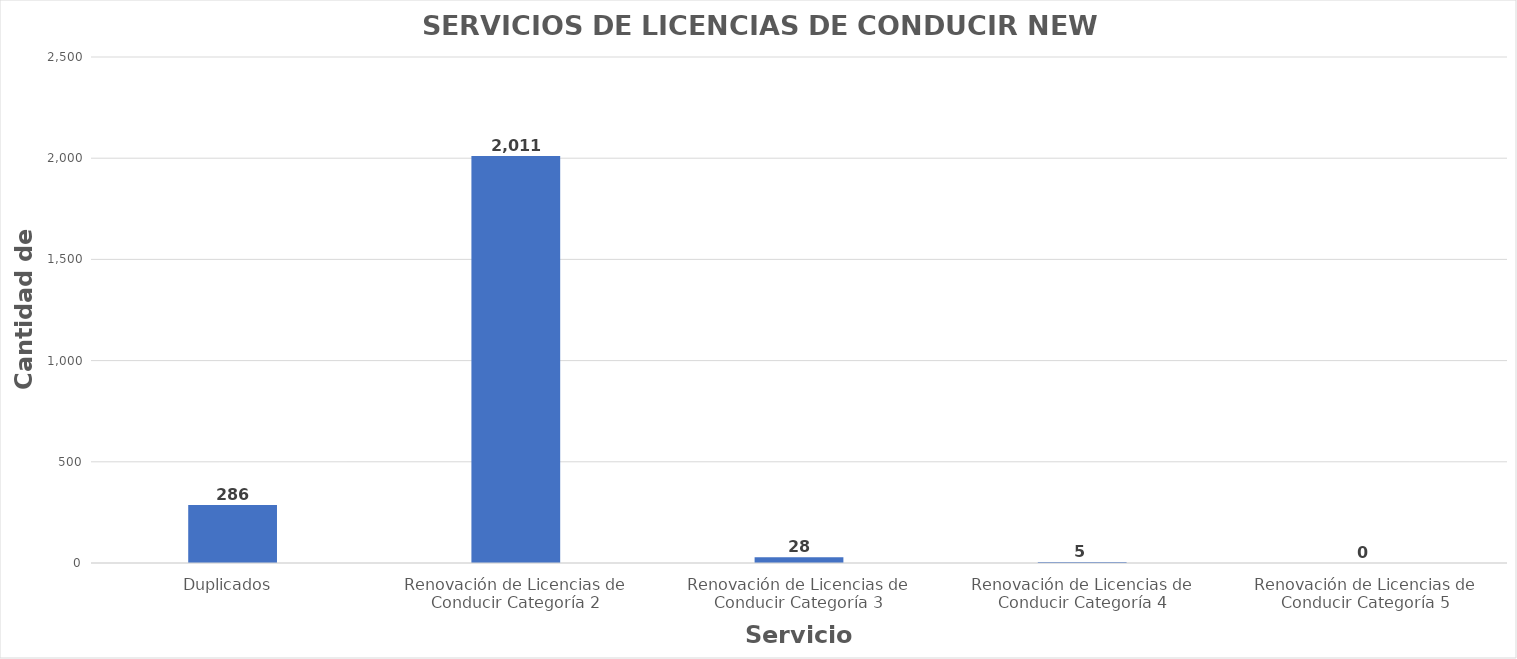
| Category | Series 0 |
|---|---|
| Duplicados  | 286 |
| Renovación de Licencias de Conducir Categoría 2 | 2011 |
| Renovación de Licencias de Conducir Categoría 3 | 28 |
| Renovación de Licencias de Conducir Categoría 4 | 5 |
| Renovación de Licencias de Conducir Categoría 5 | 0 |